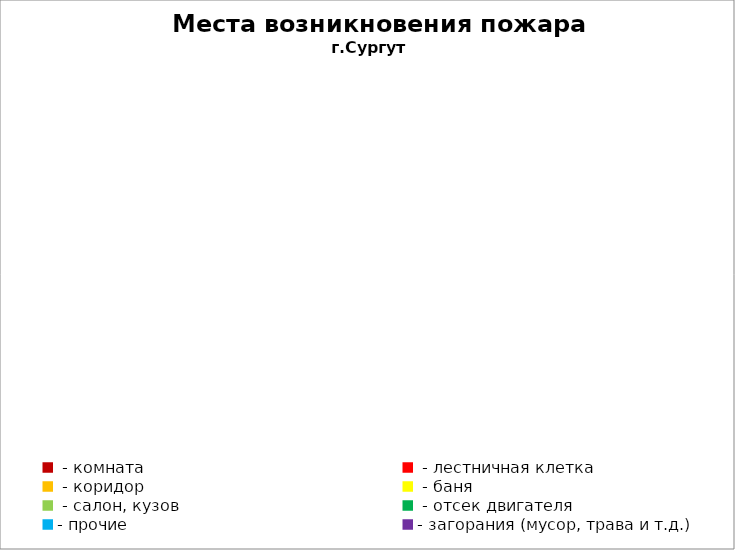
| Category | Места возникновения пожара |
|---|---|
|  - комната | 58 |
|  - лестничная клетка | 13 |
|  - коридор | 12 |
|  - баня | 50 |
|  - салон, кузов | 26 |
|  - отсек двигателя | 37 |
| - прочие | 168 |
| - загорания (мусор, трава и т.д.)  | 115 |